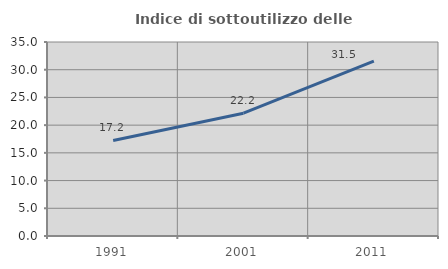
| Category | Indice di sottoutilizzo delle abitazioni  |
|---|---|
| 1991.0 | 17.241 |
| 2001.0 | 22.157 |
| 2011.0 | 31.532 |